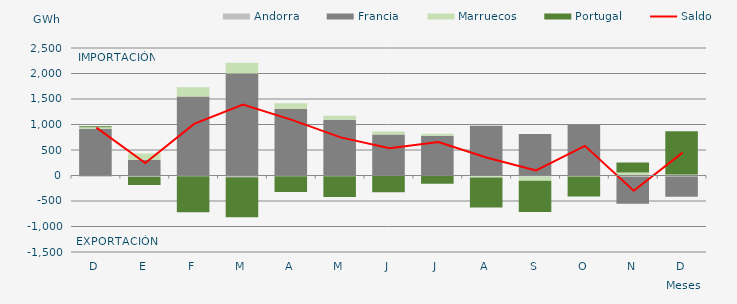
| Category | Andorra | Francia | Marruecos | Portugal |
|---|---|---|---|---|
| D | -24.685 | 915.885 | 32.032 | 15.954 |
| E | -26.717 | 310.511 | 121.876 | -159.316 |
| F | -15.973 | 1550.723 | 179.304 | -702.278 |
| M | -32.372 | 2000.98 | 212.165 | -788.594 |
| A | -13.98 | 1308.271 | 106.522 | -309.693 |
| M | -12.717 | 1093.205 | 77.107 | -409.795 |
| J | -8.299 | 804.225 | 59.96 | -319.011 |
| J | -1.488 | 777.149 | 40.929 | -159.488 |
| A | -16.745 | 974.066 | -21.389 | -587.13 |
| S | -21.816 | 812.203 | -79.308 | -613.114 |
| O | -14.818 | 993.522 | -4.279 | -393.484 |
| N | -22.557 | -531.947 | 57.949 | 199.161 |
| D | -20.764 | -396.046 | 21.949 | 843.669 |